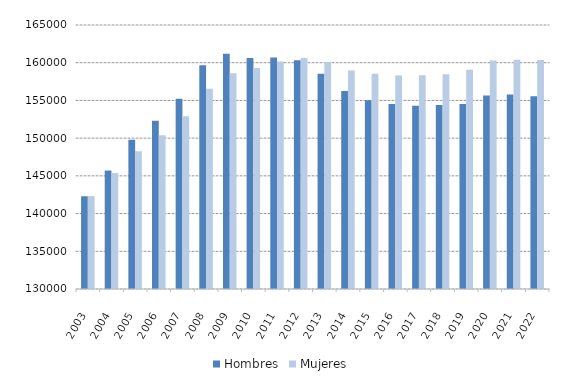
| Category | Hombres | Mujeres |
|---|---|---|
| 2003.0 | 142296 | 142312 |
| 2004.0 | 145705 | 145377 |
| 2005.0 | 149792 | 148258 |
| 2006.0 | 152320 | 150377 |
| 2007.0 | 155223 | 152895 |
| 2008.0 | 159651 | 156541 |
| 2009.0 | 161177 | 158608 |
| 2010.0 | 160628 | 159311 |
| 2011.0 | 160694 | 160156 |
| 2012.0 | 160318 | 160633 |
| 2013.0 | 158540 | 160099 |
| 2014.0 | 156245 | 158979 |
| 2015.0 | 155021 | 158548 |
| 2016.0 | 154516 | 158294 |
| 2017.0 | 154288 | 158330 |
| 2018.0 | 154409 | 158475 |
| 2019.0 | 154512 | 159059 |
| 2020.0 | 155646 | 160285 |
| 2021.0 | 155772 | 160404 |
| 2022.0 | 155538 | 160357 |